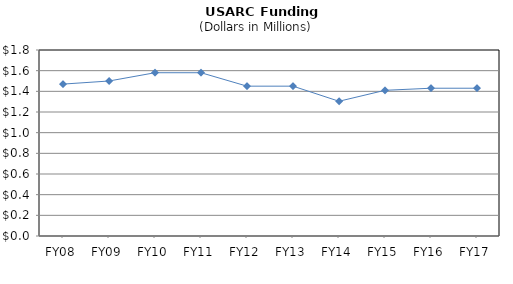
| Category | Series 0 |
|---|---|
| FY08 | 1.47 |
| FY09 | 1.5 |
| FY10 | 1.58 |
| FY11 | 1.58 |
| FY12 | 1.45 |
| FY13 | 1.45 |
| FY14 | 1.304 |
| FY15 | 1.41 |
| FY16 | 1.43 |
| FY17 | 1.43 |